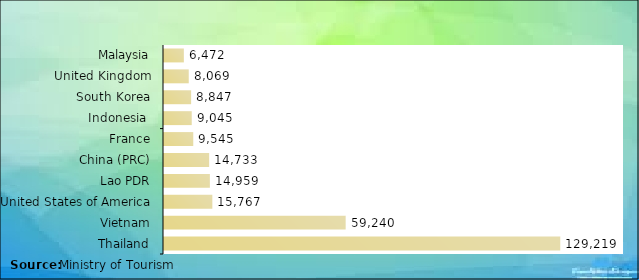
| Category | Series 0 |
|---|---|
| Thailand | 129219 |
| Vietnam | 59240 |
| United States of America | 15767 |
| Lao PDR | 14959 |
| China (PRC) | 14733 |
| France | 9545 |
| Indonesia  | 9045 |
| South Korea | 8847 |
| United Kingdom | 8069 |
| Malaysia | 6472 |